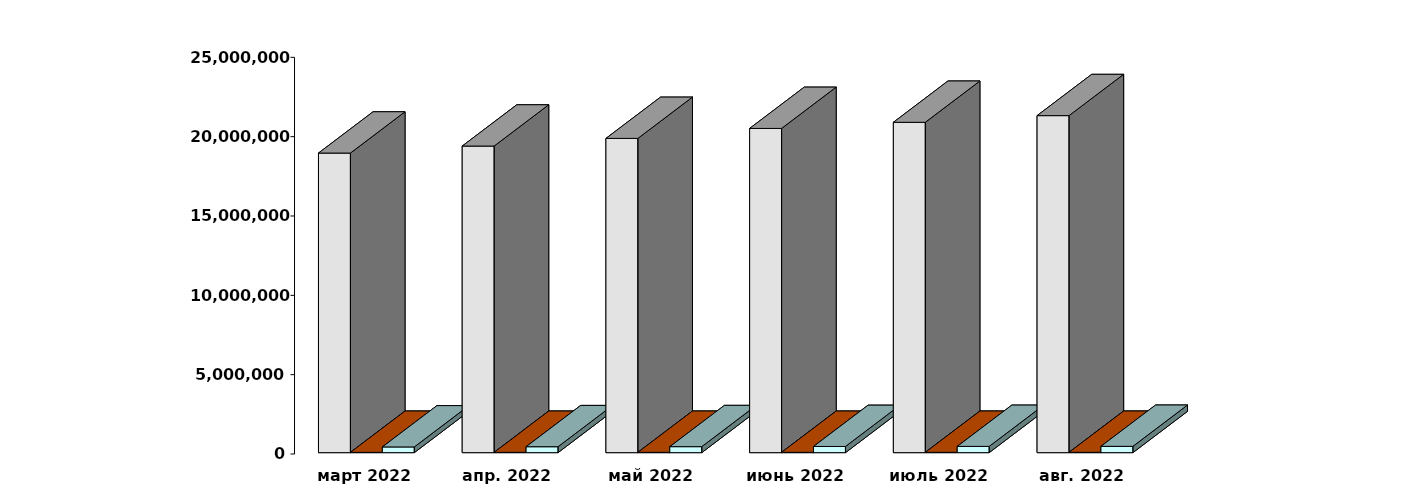
| Category | Физические лица | Юридические лица | Клиенты, передавшие свои средства в ДУ |
|---|---|---|---|
| 2022-03-30 | 18881687 | 21131 | 360205 |
| 2022-04-30 | 19323213 | 21524 | 374023 |
| 2022-05-30 | 19805248 | 21686 | 377979 |
| 2022-06-30 | 20434402 | 21881 | 390501 |
| 2022-07-30 | 20820354 | 22103 | 394494 |
| 2022-08-30 | 21241388 | 22347 | 399319 |